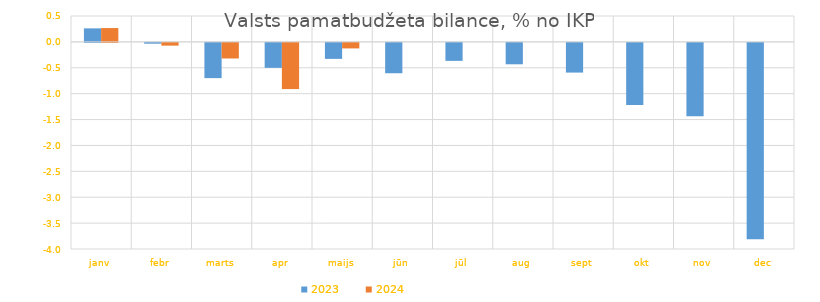
| Category | 2023 | 2024 |
|---|---|---|
| janv | 0.261 | 0.267 |
| febr | -0.015 | -0.053 |
| marts | -0.681 | -0.301 |
| apr | -0.482 | -0.892 |
| maijs | -0.309 | -0.107 |
| jūn | -0.586 | 0 |
| jūl | -0.347 | 0 |
| aug | -0.413 | 0 |
| sept | -0.574 | 0 |
| okt | -1.202 | 0 |
| nov | -1.419 | 0 |
| dec | -3.794 | 0 |